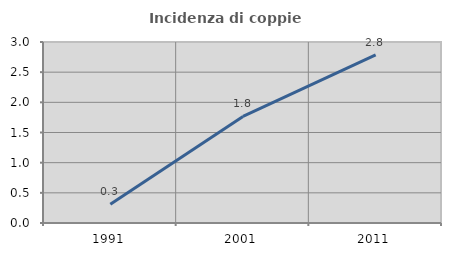
| Category | Incidenza di coppie miste |
|---|---|
| 1991.0 | 0.312 |
| 2001.0 | 1.766 |
| 2011.0 | 2.785 |